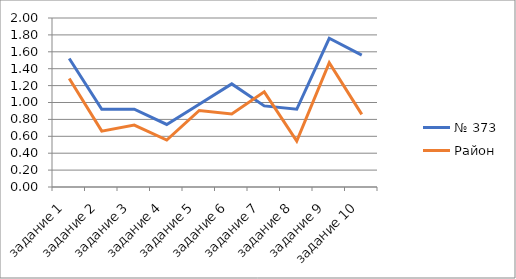
| Category | № 373 | Район |
|---|---|---|
| задание 1 | 1.52 | 1.284 |
| задание 2 | 0.92 | 0.661 |
| задание 3 | 0.92 | 0.733 |
| задание 4 | 0.74 | 0.555 |
| задание 5 | 0.98 | 0.906 |
| задание 6 | 1.22 | 0.865 |
| задание 7 | 0.96 | 1.127 |
| задание 8 | 0.92 | 0.543 |
| задание 9 | 1.76 | 1.472 |
| задание 10 | 1.56 | 0.859 |